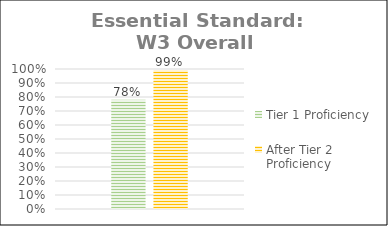
| Category | Tier 1 Proficiency | After Tier 2 Proficiency |
|---|---|---|
| 0 | 0.78 | 0.991 |